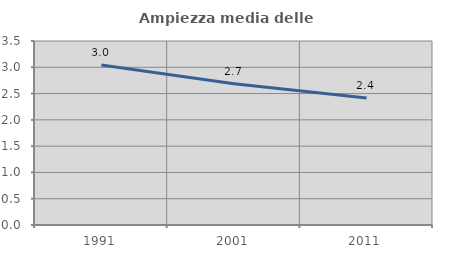
| Category | Ampiezza media delle famiglie |
|---|---|
| 1991.0 | 3.044 |
| 2001.0 | 2.688 |
| 2011.0 | 2.416 |